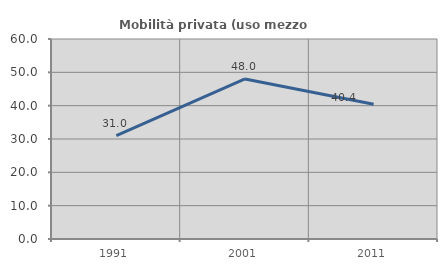
| Category | Mobilità privata (uso mezzo privato) |
|---|---|
| 1991.0 | 31.046 |
| 2001.0 | 48.016 |
| 2011.0 | 40.417 |